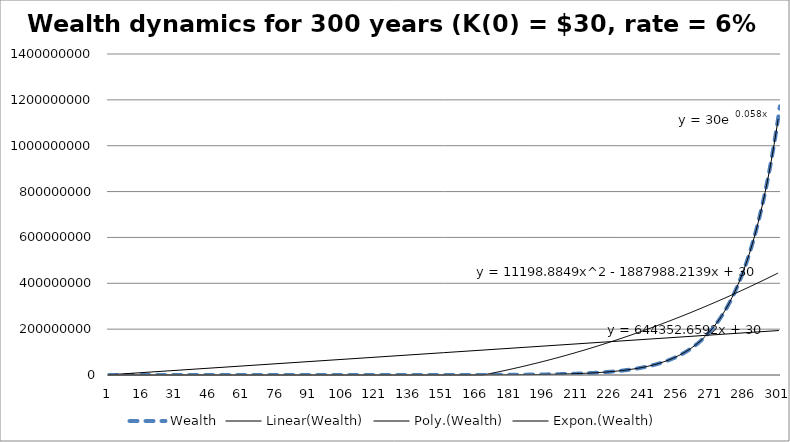
| Category | Wealth |
|---|---|
| 0 | 30 |
| 1 | 31.8 |
| 2 | 33.708 |
| 3 | 35.73 |
| 4 | 37.874 |
| 5 | 40.147 |
| 6 | 42.556 |
| 7 | 45.109 |
| 8 | 47.815 |
| 9 | 50.684 |
| 10 | 53.725 |
| 11 | 56.949 |
| 12 | 60.366 |
| 13 | 63.988 |
| 14 | 67.827 |
| 15 | 71.897 |
| 16 | 76.211 |
| 17 | 80.783 |
| 18 | 85.63 |
| 19 | 90.768 |
| 20 | 96.214 |
| 21 | 101.987 |
| 22 | 108.106 |
| 23 | 114.592 |
| 24 | 121.468 |
| 25 | 128.756 |
| 26 | 136.481 |
| 27 | 144.67 |
| 28 | 153.351 |
| 29 | 162.552 |
| 30 | 172.305 |
| 31 | 182.643 |
| 32 | 193.602 |
| 33 | 205.218 |
| 34 | 217.531 |
| 35 | 230.583 |
| 36 | 244.418 |
| 37 | 259.083 |
| 38 | 274.628 |
| 39 | 291.105 |
| 40 | 308.572 |
| 41 | 327.086 |
| 42 | 346.711 |
| 43 | 367.514 |
| 44 | 389.564 |
| 45 | 412.938 |
| 46 | 437.715 |
| 47 | 463.978 |
| 48 | 491.816 |
| 49 | 521.325 |
| 50 | 552.605 |
| 51 | 585.761 |
| 52 | 620.907 |
| 53 | 658.161 |
| 54 | 697.651 |
| 55 | 739.51 |
| 56 | 783.88 |
| 57 | 830.913 |
| 58 | 880.768 |
| 59 | 933.614 |
| 60 | 989.631 |
| 61 | 1049.009 |
| 62 | 1111.949 |
| 63 | 1178.666 |
| 64 | 1249.386 |
| 65 | 1324.349 |
| 66 | 1403.81 |
| 67 | 1488.039 |
| 68 | 1577.321 |
| 69 | 1671.96 |
| 70 | 1772.278 |
| 71 | 1878.615 |
| 72 | 1991.331 |
| 73 | 2110.811 |
| 74 | 2237.46 |
| 75 | 2371.708 |
| 76 | 2514.01 |
| 77 | 2664.851 |
| 78 | 2824.742 |
| 79 | 2994.226 |
| 80 | 3173.88 |
| 81 | 3364.313 |
| 82 | 3566.171 |
| 83 | 3780.142 |
| 84 | 4006.95 |
| 85 | 4247.367 |
| 86 | 4502.209 |
| 87 | 4772.342 |
| 88 | 5058.682 |
| 89 | 5362.203 |
| 90 | 5683.935 |
| 91 | 6024.971 |
| 92 | 6386.47 |
| 93 | 6769.658 |
| 94 | 7175.837 |
| 95 | 7606.388 |
| 96 | 8062.771 |
| 97 | 8546.537 |
| 98 | 9059.329 |
| 99 | 9602.889 |
| 100 | 10179.063 |
| 101 | 10789.806 |
| 102 | 11437.195 |
| 103 | 12123.426 |
| 104 | 12850.832 |
| 105 | 13621.882 |
| 106 | 14439.195 |
| 107 | 15305.546 |
| 108 | 16223.879 |
| 109 | 17197.312 |
| 110 | 18229.151 |
| 111 | 19322.9 |
| 112 | 20482.274 |
| 113 | 21711.21 |
| 114 | 23013.883 |
| 115 | 24394.716 |
| 116 | 25858.399 |
| 117 | 27409.902 |
| 118 | 29054.497 |
| 119 | 30797.766 |
| 120 | 32645.632 |
| 121 | 34604.37 |
| 122 | 36680.633 |
| 123 | 38881.471 |
| 124 | 41214.359 |
| 125 | 43687.22 |
| 126 | 46308.454 |
| 127 | 49086.961 |
| 128 | 52032.178 |
| 129 | 55154.109 |
| 130 | 58463.356 |
| 131 | 61971.157 |
| 132 | 65689.426 |
| 133 | 69630.792 |
| 134 | 73808.64 |
| 135 | 78237.158 |
| 136 | 82931.387 |
| 137 | 87907.271 |
| 138 | 93181.707 |
| 139 | 98772.609 |
| 140 | 104698.966 |
| 141 | 110980.904 |
| 142 | 117639.758 |
| 143 | 124698.143 |
| 144 | 132180.032 |
| 145 | 140110.834 |
| 146 | 148517.484 |
| 147 | 157428.533 |
| 148 | 166874.245 |
| 149 | 176886.7 |
| 150 | 187499.902 |
| 151 | 198749.896 |
| 152 | 210674.89 |
| 153 | 223315.383 |
| 154 | 236714.306 |
| 155 | 250917.164 |
| 156 | 265972.194 |
| 157 | 281930.526 |
| 158 | 298846.357 |
| 159 | 316777.139 |
| 160 | 335783.767 |
| 161 | 355930.793 |
| 162 | 377286.641 |
| 163 | 399923.839 |
| 164 | 423919.27 |
| 165 | 449354.426 |
| 166 | 476315.691 |
| 167 | 504894.633 |
| 168 | 535188.311 |
| 169 | 567299.609 |
| 170 | 601337.586 |
| 171 | 637417.841 |
| 172 | 675662.911 |
| 173 | 716202.686 |
| 174 | 759174.847 |
| 175 | 804725.338 |
| 176 | 853008.858 |
| 177 | 904189.39 |
| 178 | 958440.753 |
| 179 | 1015947.199 |
| 180 | 1076904.03 |
| 181 | 1141518.272 |
| 182 | 1210009.369 |
| 183 | 1282609.931 |
| 184 | 1359566.527 |
| 185 | 1441140.518 |
| 186 | 1527608.949 |
| 187 | 1619265.486 |
| 188 | 1716421.415 |
| 189 | 1819406.7 |
| 190 | 1928571.102 |
| 191 | 2044285.369 |
| 192 | 2166942.491 |
| 193 | 2296959.04 |
| 194 | 2434776.582 |
| 195 | 2580863.177 |
| 196 | 2735714.968 |
| 197 | 2899857.866 |
| 198 | 3073849.338 |
| 199 | 3258280.298 |
| 200 | 3453777.116 |
| 201 | 3661003.743 |
| 202 | 3880663.968 |
| 203 | 4113503.806 |
| 204 | 4360314.034 |
| 205 | 4621932.876 |
| 206 | 4899248.849 |
| 207 | 5193203.78 |
| 208 | 5504796.007 |
| 209 | 5835083.767 |
| 210 | 6185188.793 |
| 211 | 6556300.121 |
| 212 | 6949678.128 |
| 213 | 7366658.816 |
| 214 | 7808658.345 |
| 215 | 8277177.845 |
| 216 | 8773808.516 |
| 217 | 9300237.027 |
| 218 | 9858251.249 |
| 219 | 10449746.323 |
| 220 | 11076731.103 |
| 221 | 11741334.969 |
| 222 | 12445815.067 |
| 223 | 13192563.971 |
| 224 | 13984117.809 |
| 225 | 14823164.878 |
| 226 | 15712554.771 |
| 227 | 16655308.057 |
| 228 | 17654626.54 |
| 229 | 18713904.133 |
| 230 | 19836738.381 |
| 231 | 21026942.684 |
| 232 | 22288559.245 |
| 233 | 23625872.799 |
| 234 | 25043425.167 |
| 235 | 26546030.677 |
| 236 | 28138792.518 |
| 237 | 29827120.069 |
| 238 | 31616747.273 |
| 239 | 33513752.11 |
| 240 | 35524577.236 |
| 241 | 37656051.87 |
| 242 | 39915414.983 |
| 243 | 42310339.881 |
| 244 | 44848960.274 |
| 245 | 47539897.891 |
| 246 | 50392291.764 |
| 247 | 53415829.27 |
| 248 | 56620779.026 |
| 249 | 60018025.768 |
| 250 | 63619107.314 |
| 251 | 67436253.753 |
| 252 | 71482428.978 |
| 253 | 75771374.717 |
| 254 | 80317657.2 |
| 255 | 85136716.632 |
| 256 | 90244919.63 |
| 257 | 95659614.807 |
| 258 | 101399191.696 |
| 259 | 107483143.198 |
| 260 | 113932131.789 |
| 261 | 120768059.697 |
| 262 | 128014143.279 |
| 263 | 135694991.875 |
| 264 | 143836691.388 |
| 265 | 152466892.871 |
| 266 | 161614906.443 |
| 267 | 171311800.83 |
| 268 | 181590508.88 |
| 269 | 192485939.413 |
| 270 | 204035095.777 |
| 271 | 216277201.524 |
| 272 | 229253833.615 |
| 273 | 243009063.632 |
| 274 | 257589607.45 |
| 275 | 273044983.897 |
| 276 | 289427682.931 |
| 277 | 306793343.907 |
| 278 | 325200944.541 |
| 279 | 344713001.214 |
| 280 | 365395781.287 |
| 281 | 387319528.164 |
| 282 | 410558699.854 |
| 283 | 435192221.845 |
| 284 | 461303755.156 |
| 285 | 488981980.465 |
| 286 | 518320899.293 |
| 287 | 549420153.25 |
| 288 | 582385362.445 |
| 289 | 617328484.192 |
| 290 | 654368193.244 |
| 291 | 693630284.838 |
| 292 | 735248101.929 |
| 293 | 779362988.044 |
| 294 | 826124767.327 |
| 295 | 875692253.367 |
| 296 | 928233788.569 |
| 297 | 983927815.883 |
| 298 | 1042963484.836 |
| 299 | 1105541293.926 |
| 300 | 1171873771.561 |